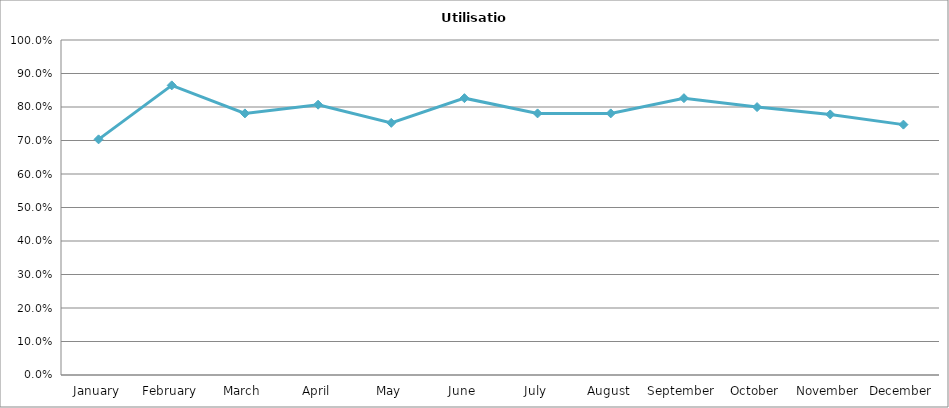
| Category | Number |
|---|---|
| January | 0.703 |
| February | 0.865 |
| March | 0.781 |
| April | 0.807 |
| May | 0.753 |
| June | 0.826 |
| July | 0.781 |
| August | 0.781 |
| September | 0.826 |
| October | 0.8 |
| November | 0.778 |
| December | 0.747 |